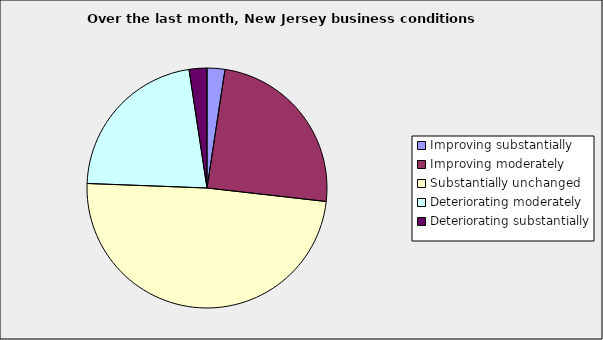
| Category | Series 0 |
|---|---|
| Improving substantially | 0.024 |
| Improving moderately | 0.244 |
| Substantially unchanged | 0.488 |
| Deteriorating moderately | 0.22 |
| Deteriorating substantially | 0.024 |